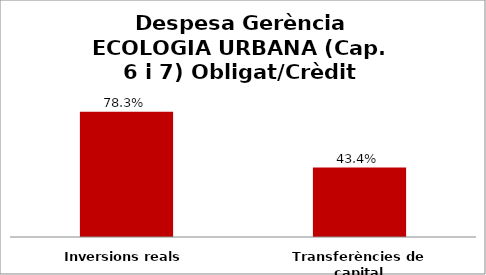
| Category | Series 0 |
|---|---|
| Inversions reals | 0.783 |
| Transferències de capital | 0.434 |